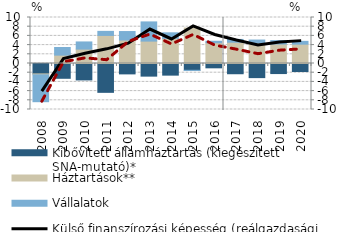
| Category | Kibővített államháztartás (kiegészített SNA-mutató)* | Háztartások** | Vállalatok |
|---|---|---|---|
| 2008.0 | -2.261 | -0.201 | -5.841 |
| 2009.0 | -3.215 | 1.82 | 1.662 |
| 2010.0 | -3.57 | 3.127 | 1.56 |
| 2011.0 | -6.269 | 6.102 | 0.882 |
| 2012.0 | -2.257 | 5.101 | 1.847 |
| 2013.0 | -2.746 | 4.868 | 4.173 |
| 2014.0 | -2.53 | 5.469 | 1.201 |
| 2015.0 | -1.478 | 7.716 | -0.031 |
| 2016.0 | -0.94 | 4.508 | 0.327 |
| 2017.0 | -2.225 | 4.63 | 0.602 |
| 2018.0 | -3.07 | 4.422 | 0.675 |
| 2019.0 | -2.188 | 4.237 | 0.74 |
| 2020.0 | -1.735 | 4.202 | 0.613 |